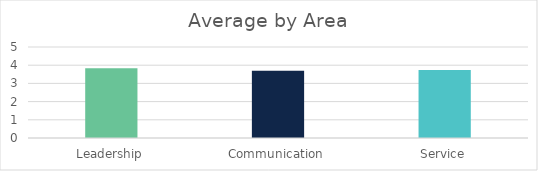
| Category | Series 0 |
|---|---|
| Leadership | 3.83 |
| Communication | 3.69 |
| Service | 3.73 |